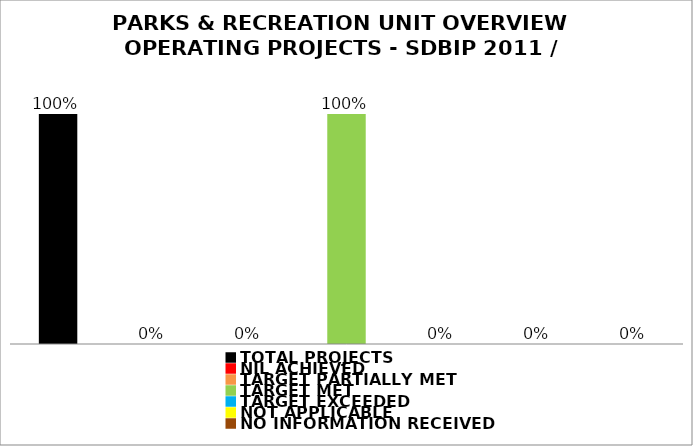
| Category | Series 0 |
|---|---|
| TOTAL PROJECTS | 1 |
| NIL ACHIEVED | 0 |
| TARGET PARTIALLY MET | 0 |
| TARGET MET | 1 |
| TARGET EXCEEDED | 0 |
| NOT APPLICABLE | 0 |
| NO INFORMATION RECEIVED | 0 |